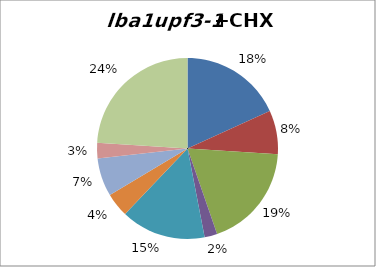
| Category | Series 0 |
|---|---|
| protein metabolism | 72 |
| misc | 31 |
| RNA | 74 |
| DNA | 9 |
| metabolism | 60 |
| signalling | 17 |
| cell division and development | 27 |
| stress | 11 |
| not assigned | 95 |